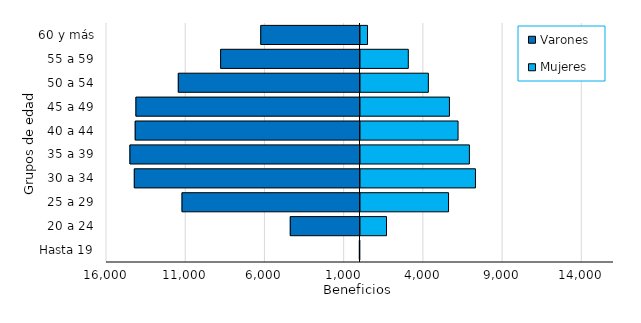
| Category | Varones | Mujeres |
|---|---|---|
| Hasta 19 | -41 | 13 |
| 20 a 24 | -4401 | 1706 |
| 25 a 29 | -11234 | 5621 |
| 30 a 34 | -14245 | 7319 |
| 35 a 39 | -14523 | 6936 |
| 40 a 44 | -14188 | 6220 |
| 45 a 49 | -14143 | 5677 |
| 50 a 54 | -11468 | 4346 |
| 55 a 59 | -8796 | 3080 |
| 60 y más | -6264 | 505 |